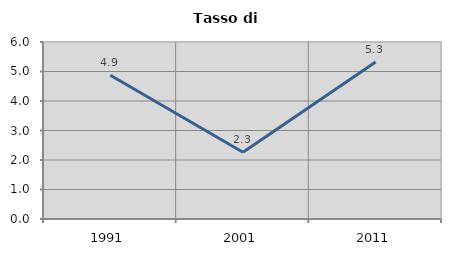
| Category | Tasso di disoccupazione   |
|---|---|
| 1991.0 | 4.874 |
| 2001.0 | 2.262 |
| 2011.0 | 5.321 |